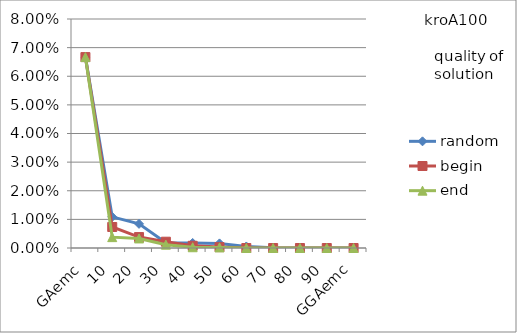
| Category | random | begin | end |
|---|---|---|---|
| 0 | 0.067 | 0.067 | 0.067 |
| 1 | 0.011 | 0.007 | 0.004 |
| 2 | 0.008 | 0.004 | 0.003 |
| 3 | 0.002 | 0.002 | 0.001 |
| 4 | 0.002 | 0.001 | 0 |
| 5 | 0.002 | 0 | 0 |
| 6 | 0.001 | 0 | 0 |
| 7 | 0 | 0 | 0 |
| 8 | 0 | 0 | 0 |
| 9 | 0 | 0 | 0 |
| 10 | 0 | 0 | 0 |